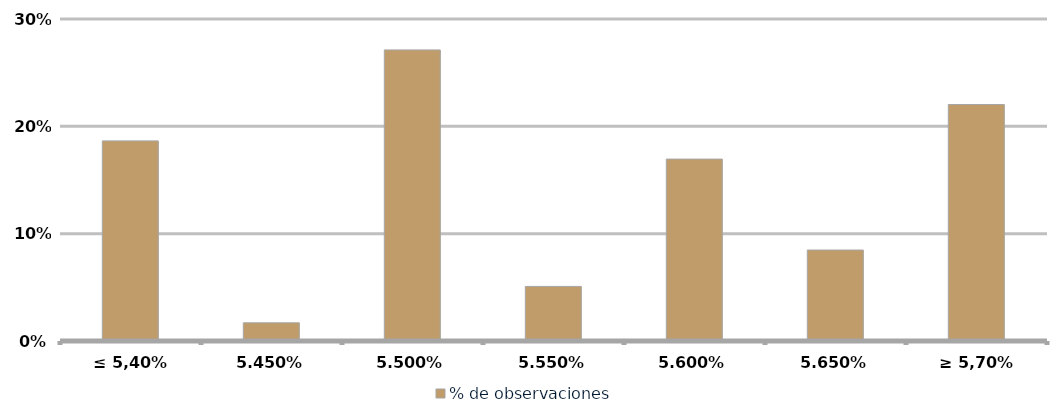
| Category | % de observaciones  |
|---|---|
| ≤ 5,40% | 0.186 |
| 5,45% | 0.017 |
| 5,50% | 0.271 |
| 5,55% | 0.051 |
| 5,60% | 0.169 |
| 5,65% | 0.085 |
| ≥ 5,70% | 0.22 |